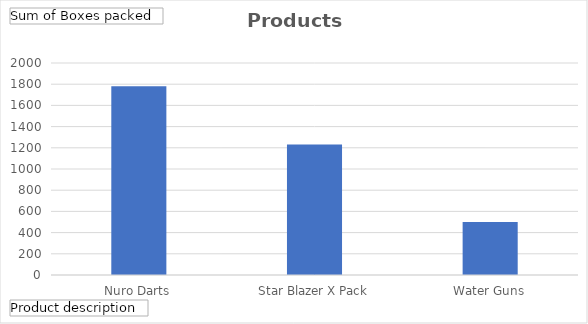
| Category | Total |
|---|---|
| Nuro Darts | 1780 |
| Star Blazer X Pack | 1230 |
| Water Guns | 500 |